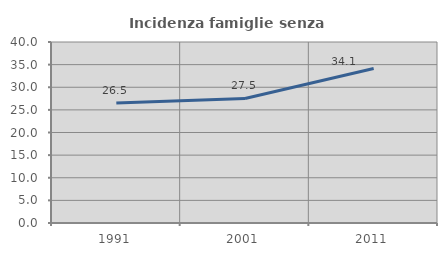
| Category | Incidenza famiglie senza nuclei |
|---|---|
| 1991.0 | 26.525 |
| 2001.0 | 27.524 |
| 2011.0 | 34.148 |